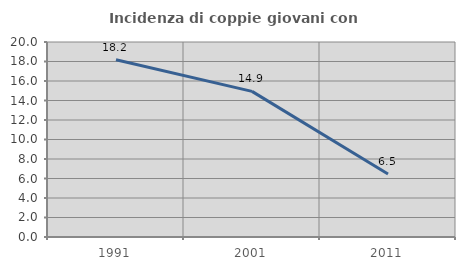
| Category | Incidenza di coppie giovani con figli |
|---|---|
| 1991.0 | 18.182 |
| 2001.0 | 14.939 |
| 2011.0 | 6.457 |